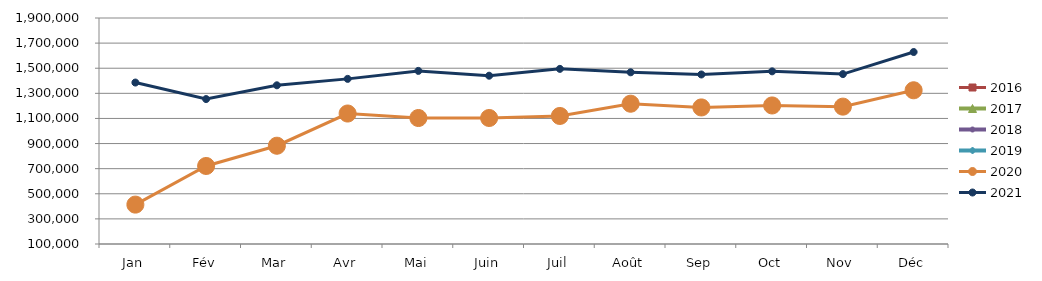
| Category | 2015 | 2016 | 2017 | 2018 | 2019 | 2020 | 2021 |
|---|---|---|---|---|---|---|---|
| Jan |  | 0 | 0 | 0 | 0 | 413718.973 | 1385841.188 |
| Fév |  | 0 | 0 | 0 | 0 | 721421.241 | 1254294.981 |
| Mar |  | 0 | 0 | 0 | 0 | 882604.122 | 1363936.74 |
| Avr |  | 0 | 0 | 0 | 0 | 1139215.204 | 1415132.587 |
| Mai |  | 0 | 0 | 0 | 0 | 1103343.599 | 1478708.989 |
| Juin |  | 0 | 0 | 0 | 0 | 1103576.761 | 1440368.873 |
| Juil |  | 0 | 0 | 0 | 0 | 1119722.736 | 1494841.171 |
| Août |  | 0 | 0 | 0 | 0 | 1217354.798 | 1467575.235 |
| Sep |  | 0 | 0 | 0 | 0 | 1187669.872 | 1450120.701 |
| Oct |  | 0 | 0 | 0 | 0 | 1203449.934 | 1475187.371 |
| Nov |  | 0 | 0 | 0 | 0 | 1194014.644 | 1453215.071 |
| Déc |  | 0 | 0 | 0 | 0 | 1324311.651 | 1629008.122 |